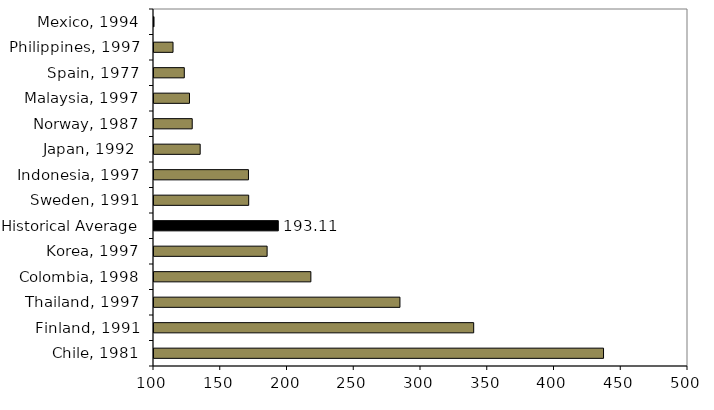
| Category | Series 0 |
|---|---|
| Chile, 1981 | 436.734 |
| Finland, 1991 | 339.47 |
| Thailand, 1997 | 284.233 |
| Colombia, 1998 | 217.506 |
| Korea, 1997 | 184.728 |
| Historical Average | 193.111 |
| Sweden, 1991 | 170.928 |
| Indonesia, 1997 | 170.759 |
| Japan, 1992  | 134.586 |
| Norway, 1987 | 128.629 |
| Malaysia, 1997 | 126.588 |
| Spain, 1977 | 122.701 |
| Philippines, 1997 | 114.246 |
| Mexico, 1994 | 79.337 |